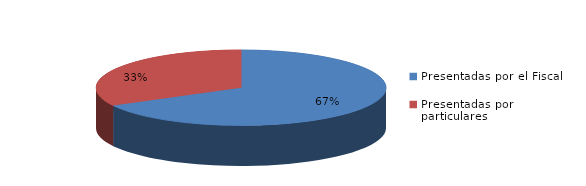
| Category | Series 0 |
|---|---|
| Presentadas por el Fiscal | 204 |
| Presentadas por particulares | 100 |